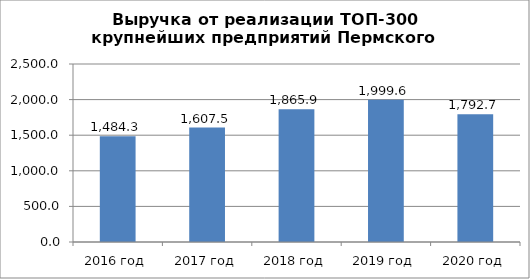
| Category | Выручка от реализации |
|---|---|
| 2016 год | 1484.3 |
| 2017 год | 1607.5 |
| 2018 год | 1865.9 |
| 2019 год | 1999.6 |
| 2020 год | 1792.7 |